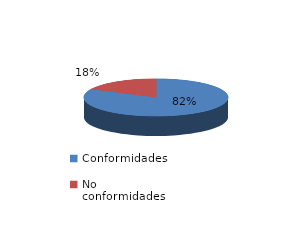
| Category | Series 0 |
|---|---|
| Conformidades | 120 |
| No conformidades | 26 |